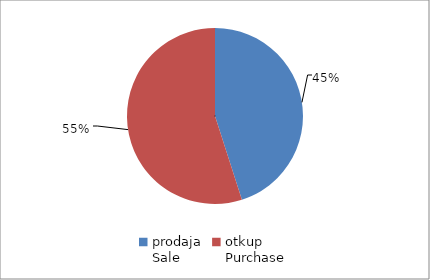
| Category | Series 0 |
|---|---|
| prodaja
Sale | 54115003.79 |
| otkup
Purchase | 65988667.5 |